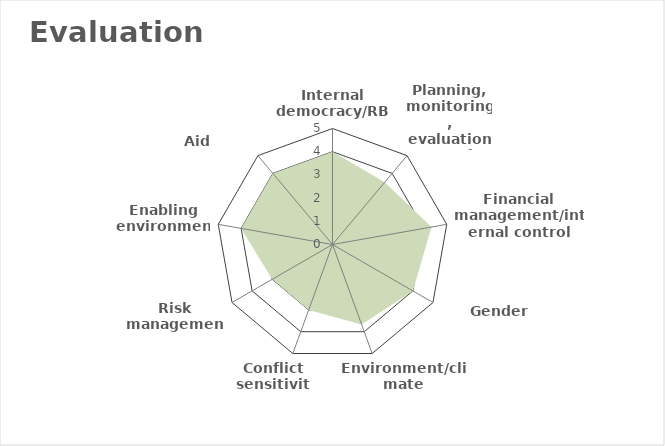
| Category | Series 0 | Series 1 | Series 2 | Series 3 |
|---|---|---|---|---|
| Internal democracy/RBA |  |  |  | 4 |
| Planning, monitoring, evaluation, reporting  |  |  |  | 3.5 |
| Financial management/internal control |  |  |  | 4.333 |
| Gender equality |  |  |  | 4 |
| Environment/climate |  |  |  | 3.667 |
| Conflict sensitivity |  |  |  | 3 |
| Risk management |  |  |  | 3 |
| Enabling environment |  |  |  | 4 |
| Aid Effectiveness |  |  |  | 4 |